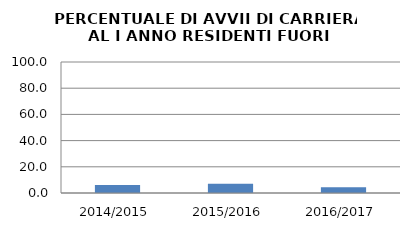
| Category | 2014/2015 2015/2016 2016/2017 |
|---|---|
| 2014/2015 | 6.18 |
| 2015/2016 | 7.143 |
| 2016/2017 | 4.294 |